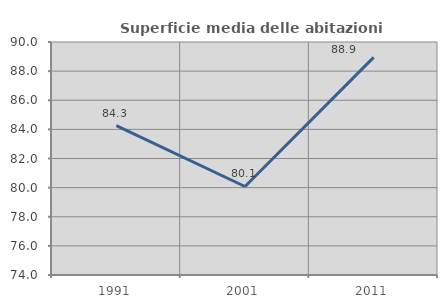
| Category | Superficie media delle abitazioni occupate |
|---|---|
| 1991.0 | 84.264 |
| 2001.0 | 80.079 |
| 2011.0 | 88.94 |